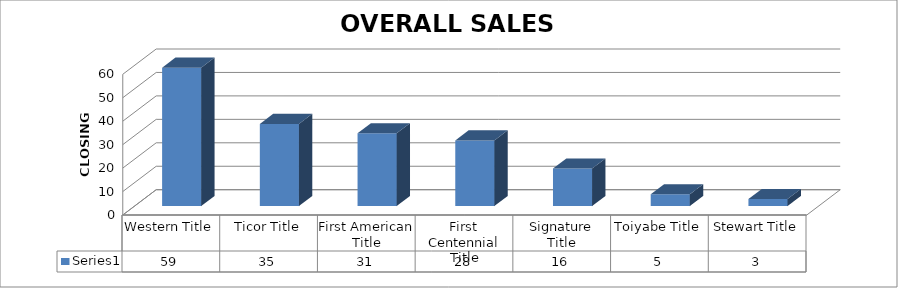
| Category | Series 0 |
|---|---|
| Western Title | 59 |
| Ticor Title | 35 |
| First American Title | 31 |
| First Centennial Title | 28 |
| Signature Title | 16 |
| Toiyabe Title | 5 |
| Stewart Title | 3 |